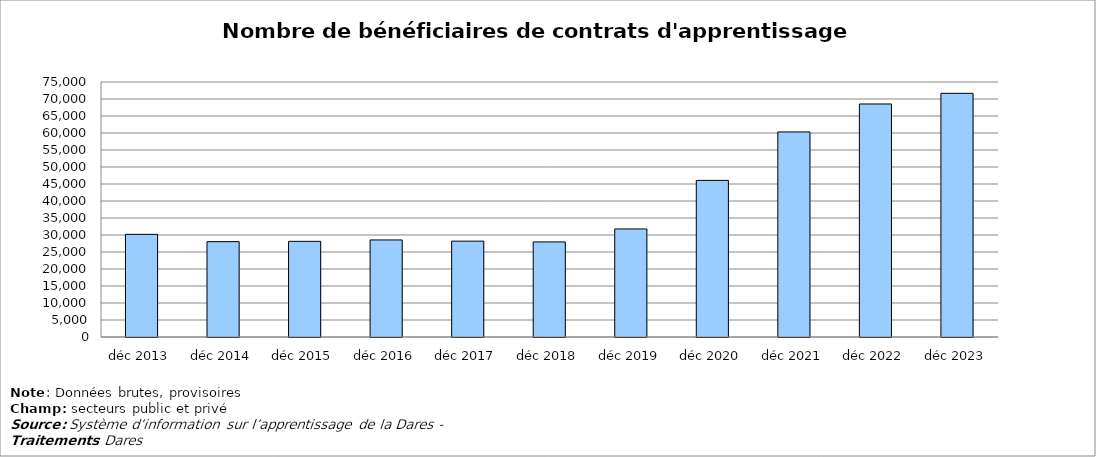
| Category | Series 0 |
|---|---|
| déc 2013 | 30190 |
| déc 2014 | 28047 |
| déc 2015 | 28133 |
| déc 2016 | 28546 |
| déc 2017 | 28192 |
| déc 2018 | 27968 |
| déc 2019 | 31782 |
| déc 2020 | 46064 |
| déc 2021 | 60310 |
| déc 2022 | 68538 |
| déc 2023 | 71672 |